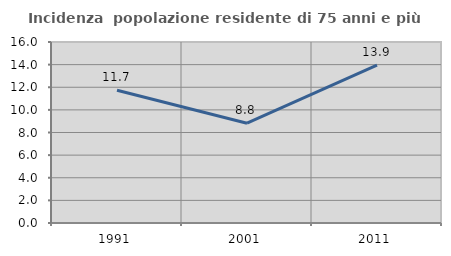
| Category | Incidenza  popolazione residente di 75 anni e più |
|---|---|
| 1991.0 | 11.735 |
| 2001.0 | 8.818 |
| 2011.0 | 13.95 |